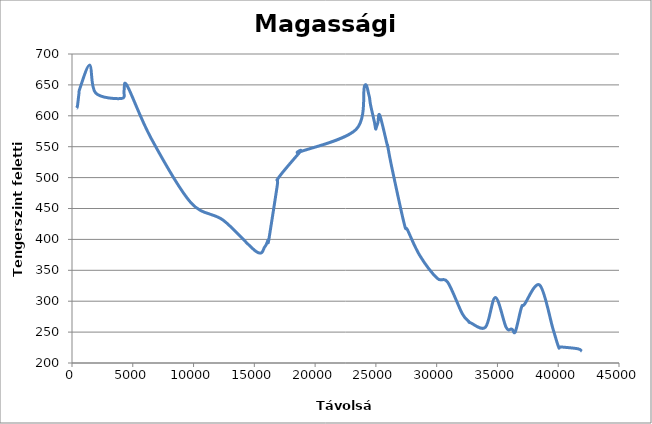
| Category | Series 0 |
|---|---|
| 361.0 | 613 |
| 442.0 | 615 |
| 567.0 | 635 |
| 661.0 | 645 |
| 1467.0 | 682 |
| 1942.0 | 637 |
| 4084.0 | 628 |
| 4282.0 | 641 |
| 4557.0 | 648 |
| 6498.0 | 564 |
| 9754.0 | 460 |
| 12445.0 | 431 |
| 15178.0 | 380 |
| 15862.0 | 388 |
| 16125.0 | 399 |
| 16205.0 | 401 |
| 16886.0 | 487 |
| 16999.0 | 500 |
| 18779.0 | 542 |
| 18806.0 | 542 |
| 23374.0 | 578 |
| 24063.0 | 648 |
| 24434.0 | 633 |
| 24557.0 | 618 |
| 24877.0 | 590 |
| 24976.0 | 579 |
| 25017.0 | 580 |
| 25030.0 | 581 |
| 25166.0 | 589 |
| 25320.0 | 601 |
| 25930.0 | 553 |
| 25962.0 | 552 |
| 26283.0 | 519 |
| 27321.0 | 426 |
| 27609.0 | 415 |
| 28609.0 | 374 |
| 30048.0 | 337 |
| 30900.0 | 331 |
| 32100.0 | 280 |
| 32658.0 | 267 |
| 32673.0 | 266 |
| 32792.0 | 265 |
| 34019.0 | 258 |
| 34827.0 | 306 |
| 35707.0 | 258 |
| 36139.0 | 255 |
| 36238.0 | 254 |
| 36479.0 | 251 |
| 36976.0 | 290 |
| 37223.0 | 295 |
| 38482.0 | 326 |
| 39572.0 | 255 |
| 40030.0 | 226 |
| 40213.0 | 226 |
| 41624.0 | 223 |
| 41945.0 | 219 |